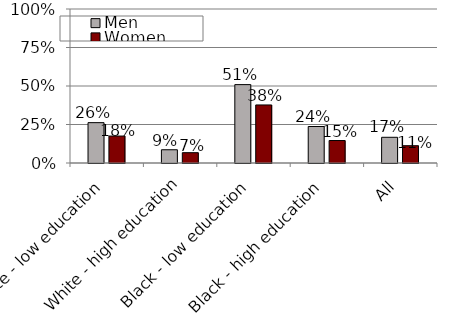
| Category | Men | Women |
|---|---|---|
| White - low education | 0.262 | 0.175 |
| White - high education | 0.086 | 0.067 |
| Black - low education | 0.509 | 0.377 |
| Black - high education | 0.237 | 0.146 |
| All | 0.167 | 0.112 |